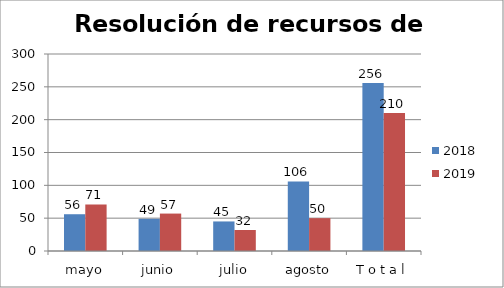
| Category | 2018 | 2019 |
|---|---|---|
| mayo | 56 | 71 |
| junio | 49 | 57 |
| julio | 45 | 32 |
| agosto | 106 | 50 |
| T o t a l | 256 | 210 |